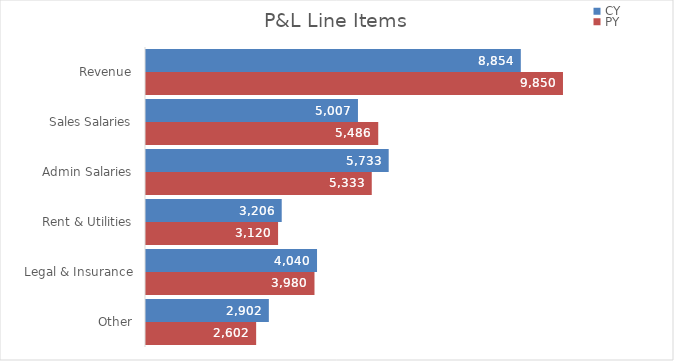
| Category | CY | PY |
|---|---|---|
| Revenue | 8854 | 9850 |
| Sales Salaries | 5007 | 5486 |
| Admin Salaries | 5733 | 5333 |
| Rent & Utilities | 3206 | 3120 |
| Legal & Insurance | 4040 | 3980 |
| Other | 2902 | 2602 |